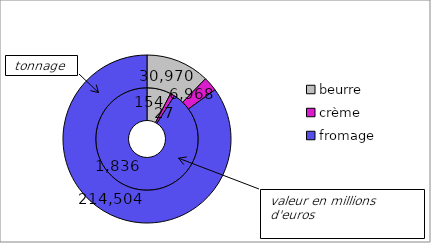
| Category | Series 0 | Series 1 |
|---|---|---|
| beurre | 154 | 30970 |
| crème  | 27.497 | 6968 |
| fromage | 1836.231 | 214503.72 |